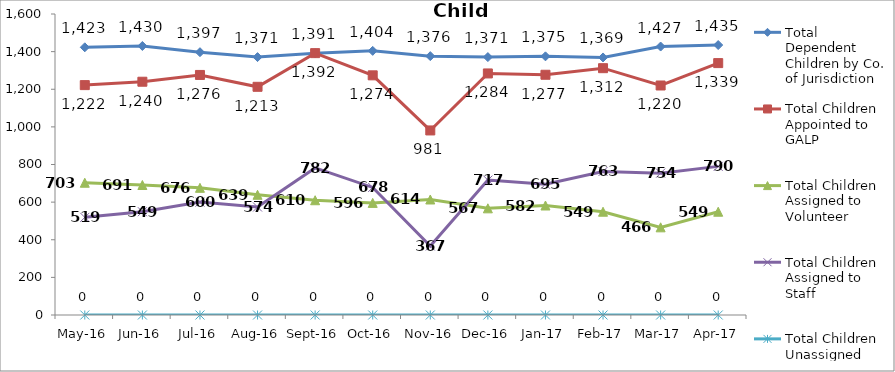
| Category | Total Dependent Children by Co. of Jurisdiction | Total Children Appointed to GALP | Total Children Assigned to Volunteer | Total Children Assigned to Staff | Total Children Unassigned |
|---|---|---|---|---|---|
| May-16 | 1423 | 1222 | 703 | 519 | 0 |
| Jun-16 | 1430 | 1240 | 691 | 549 | 0 |
| Jul-16 | 1397 | 1276 | 676 | 600 | 0 |
| Aug-16 | 1371 | 1213 | 639 | 574 | 0 |
| Sep-16 | 1391 | 1392 | 610 | 782 | 0 |
| Oct-16 | 1404 | 1274 | 596 | 678 | 0 |
| Nov-16 | 1376 | 981 | 614 | 367 | 0 |
| Dec-16 | 1371 | 1284 | 567 | 717 | 0 |
| Jan-17 | 1375 | 1277 | 582 | 695 | 0 |
| Feb-17 | 1369 | 1312 | 549 | 763 | 0 |
| Mar-17 | 1427 | 1220 | 466 | 754 | 0 |
| Apr-17 | 1435 | 1339 | 549 | 790 | 0 |